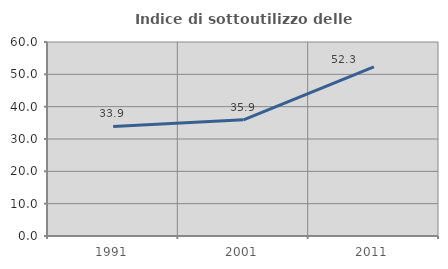
| Category | Indice di sottoutilizzo delle abitazioni  |
|---|---|
| 1991.0 | 33.898 |
| 2001.0 | 35.932 |
| 2011.0 | 52.331 |